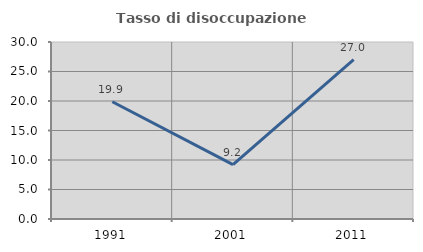
| Category | Tasso di disoccupazione giovanile  |
|---|---|
| 1991.0 | 19.876 |
| 2001.0 | 9.211 |
| 2011.0 | 27.027 |